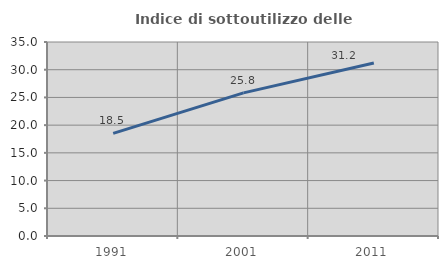
| Category | Indice di sottoutilizzo delle abitazioni  |
|---|---|
| 1991.0 | 18.505 |
| 2001.0 | 25.819 |
| 2011.0 | 31.214 |